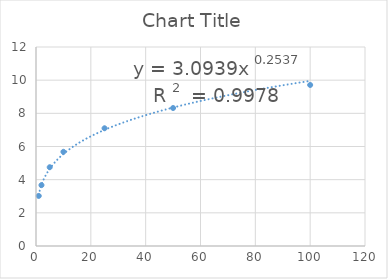
| Category | Series 0 |
|---|---|
| 1.0 | 3.02 |
| 2.0 | 3.67 |
| 5.0 | 4.75 |
| 10.0 | 5.68 |
| 25.0 | 7.1 |
| 50.0 | 8.32 |
| 100.0 | 9.71 |